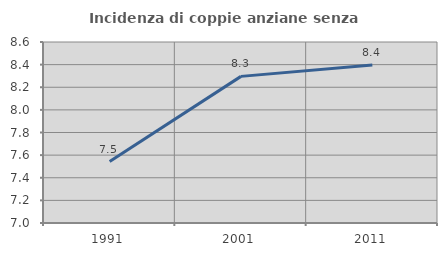
| Category | Incidenza di coppie anziane senza figli  |
|---|---|
| 1991.0 | 7.543 |
| 2001.0 | 8.296 |
| 2011.0 | 8.397 |